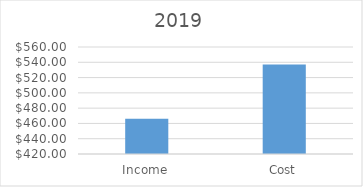
| Category | 2019 |
|---|---|
| Income | 466 |
| Cost | 537 |